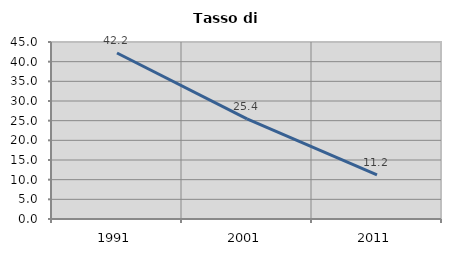
| Category | Tasso di disoccupazione   |
|---|---|
| 1991.0 | 42.202 |
| 2001.0 | 25.439 |
| 2011.0 | 11.215 |